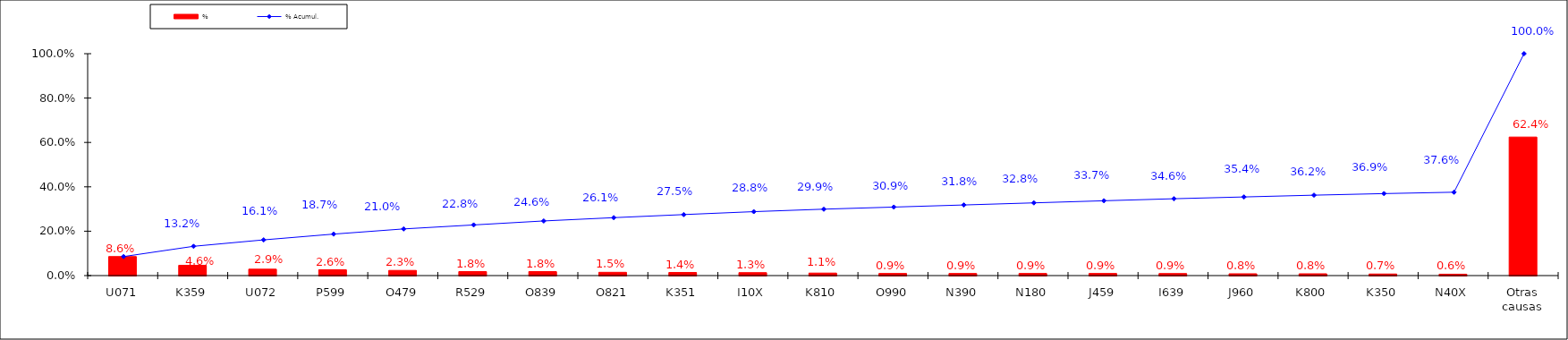
| Category | % |
|---|---|
| U071 | 0.086 |
| K359 | 0.046 |
| U072 | 0.029 |
| P599 | 0.026 |
| O479 | 0.023 |
| R529 | 0.018 |
| O839 | 0.018 |
| O821 | 0.015 |
| K351 | 0.014 |
| I10X | 0.013 |
| K810 | 0.011 |
| O990 | 0.009 |
| N390 | 0.009 |
| N180 | 0.009 |
| J459 | 0.009 |
| I639 | 0.009 |
| J960 | 0.008 |
| K800 | 0.008 |
| K350 | 0.007 |
| N40X | 0.006 |
| Otras causas | 0.624 |